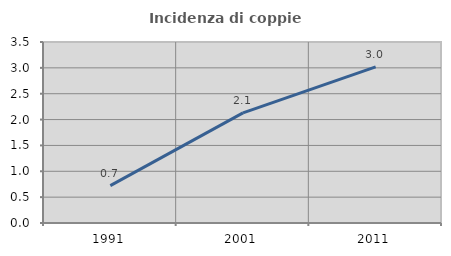
| Category | Incidenza di coppie miste |
|---|---|
| 1991.0 | 0.722 |
| 2001.0 | 2.13 |
| 2011.0 | 3.019 |